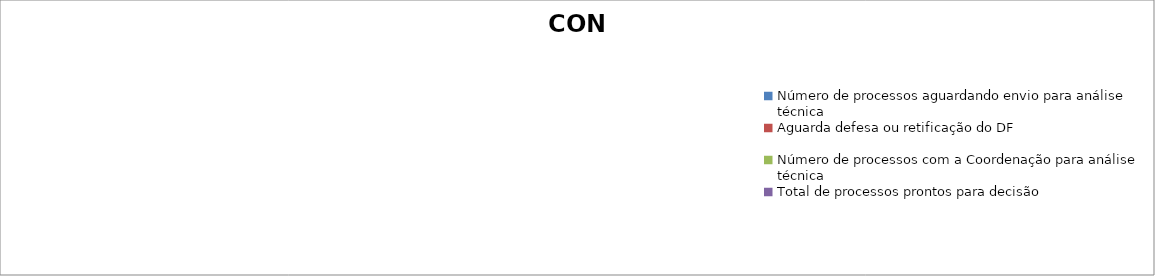
| Category | CDPO |
|---|---|
| Número de processos aguardando envio para análise técnica | 0 |
| Aguarda defesa ou retificação do DF | 0 |
| Número de processos com a Coordenação para análise técnica | 0 |
| Total de processos prontos para decisão | 0 |